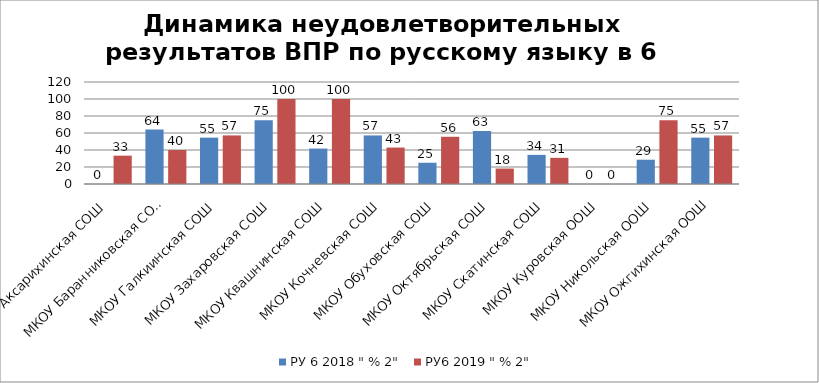
| Category | РУ 6 2018 " % 2" | РУ6 2019 " % 2" |
|---|---|---|
| МКОУ Аксарихинская СОШ | 0 | 33.333 |
| МКОУ Баранниковская СОШ | 64 | 40 |
| МКОУ Галкиинская СОШ | 54.545 | 57.143 |
| МКОУ Захаровская СОШ | 75 | 100 |
| МКОУ Квашнинская СОШ | 41.667 | 100 |
| МКОУ Кочневская СОШ | 57.143 | 42.857 |
| МКОУ Обуховская СОШ | 25 | 55.556 |
| МКОУ Октябрьская СОШ | 62.5 | 18.182 |
| МКОУ Скатинская СОШ | 34.286 | 30.769 |
| МКОУ Куровская ООШ | 0 | 0 |
| МКОУ Никольская ООШ | 28.571 | 75 |
| МКОУ Ожгихинская ООШ | 54.545 | 57.143 |